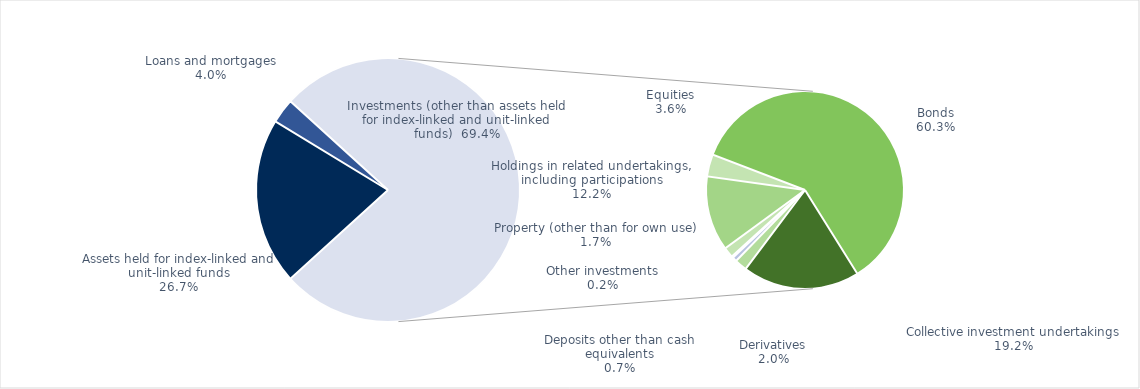
| Category | Series 0 |
|---|---|
| Assets held for index-linked and unit-linked funds | 0.267 |
| Loans and mortgages | 0.04 |
| Property (other than for own use) | 0.017 |
| Holdings in related undertakings, including participations | 0.122 |
| Equities | 0.036 |
| Bonds | 0.603 |
| Collective investment undertakings | 0.192 |
| Derivatives | 0.02 |
| Deposits other than cash equivalents | 0.007 |
| Other investments | 0.002 |